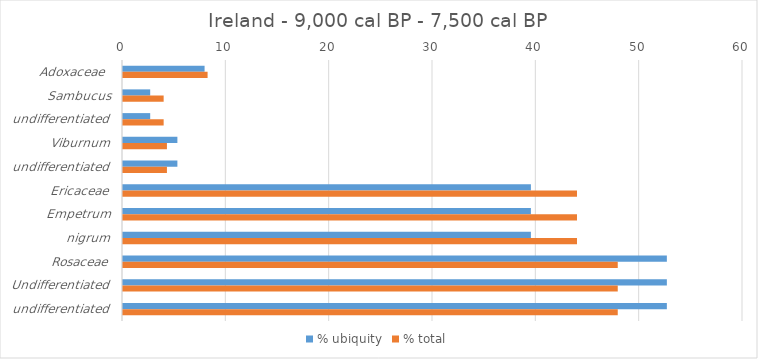
| Category | % ubiquity | % total |
|---|---|---|
| Adoxaceae  | 7.895 | 8.186 |
| Sambucus | 2.632 | 3.934 |
| undifferentiated | 2.632 | 3.934 |
| Viburnum | 5.263 | 4.252 |
| undifferentiated | 5.263 | 4.252 |
| Ericaceae | 39.474 | 43.935 |
| Empetrum | 39.474 | 43.935 |
| nigrum | 39.474 | 43.935 |
| Rosaceae | 52.632 | 47.879 |
| Undifferentiated | 52.632 | 47.879 |
| undifferentiated | 52.632 | 47.879 |